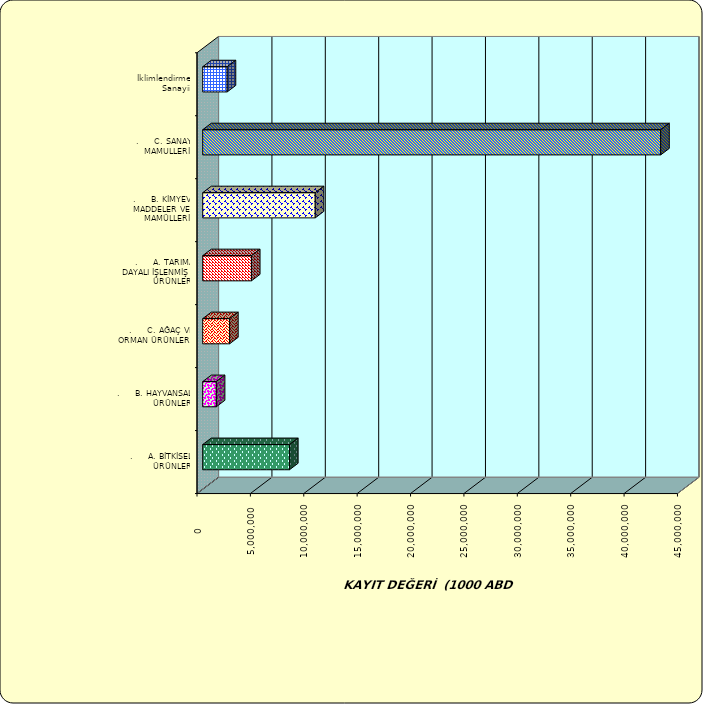
| Category | Series 0 |
|---|---|
| .     A. BİTKİSEL ÜRÜNLER | 8131144.885 |
| .     B. HAYVANSAL ÜRÜNLER | 1273643.433 |
| .     C. AĞAÇ VE ORMAN ÜRÜNLERİ | 2518640.786 |
| .     A. TARIMA DAYALI İŞLENMİŞ ÜRÜNLER | 4564848.485 |
| .     B. KİMYEVİ MADDELER VE MAMÜLLERİ | 10541276.791 |
| .     C. SANAYİ MAMULLERİ | 42895407.184 |
|  İklimlendirme Sanayii | 2291817.613 |